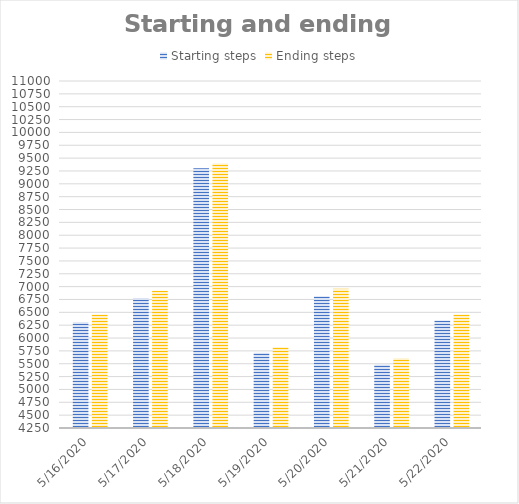
| Category | Starting steps | Ending steps |
|---|---|---|
| 5/16/20 | 6308 | 6458 |
| 5/17/20 | 6781 | 6919 |
| 5/18/20 | 9303 | 9396 |
| 5/19/20 | 5716 | 5823 |
| 5/20/20 | 6815 | 6957 |
| 5/21/20 | 5483 | 5606 |
| 5/22/20 | 6341 | 6460 |